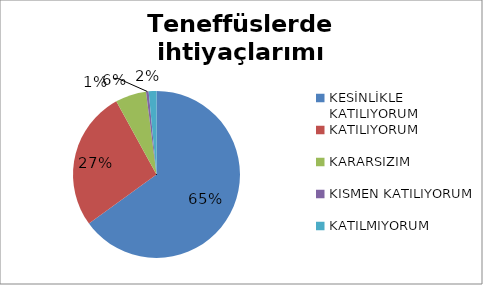
| Category | Teneffüslerde ihtiyaçlarımı giderebiliyorum. |
|---|---|
| KESİNLİKLE KATILIYORUM | 130 |
| KATILIYORUM | 54 |
| KARARSIZIM | 12 |
| KISMEN KATILIYORUM | 1 |
| KATILMIYORUM | 3 |